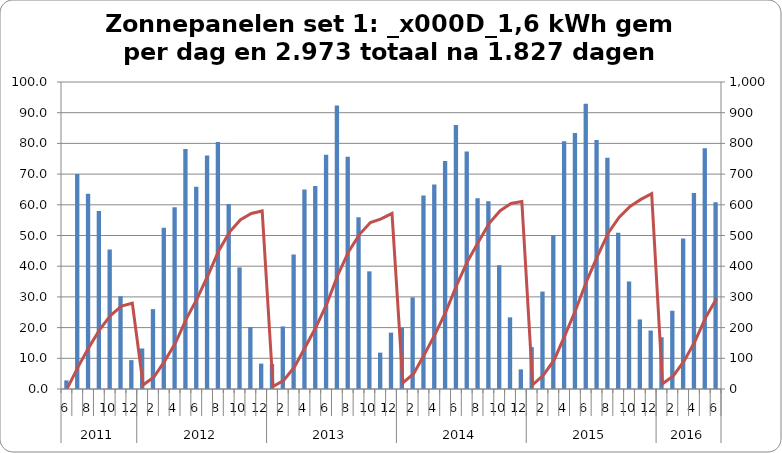
| Category | Som van kWh |
|---|---|
| 0 | 2.81 |
| 1 | 70.026 |
| 2 | 63.564 |
| 3 | 58 |
| 4 | 45.4 |
| 5 | 30.2 |
| 6 | 9.4 |
| 7 | 13.2 |
| 8 | 26 |
| 9 | 52.5 |
| 10 | 59.2 |
| 11 | 78.2 |
| 12 | 65.9 |
| 13 | 76.053 |
| 14 | 80.447 |
| 15 | 60.3 |
| 16 | 39.61 |
| 17 | 20.19 |
| 18 | 8.27 |
| 19 | 8.14 |
| 20 | 20.38 |
| 21 | 43.84 |
| 22 | 65.01 |
| 23 | 66.1 |
| 24 | 76.34 |
| 25 | 92.37 |
| 26 | 75.63 |
| 27 | 55.97 |
| 28 | 38.32 |
| 29 | 11.84 |
| 30 | 18.36 |
| 31 | 20.02 |
| 32 | 29.844 |
| 33 | 63.07 |
| 34 | 66.64 |
| 35 | 74.28 |
| 36 | 85.97 |
| 37 | 77.4 |
| 38 | 62.13 |
| 39 | 61.18 |
| 40 | 40.32 |
| 41 | 23.35 |
| 42 | 6.39 |
| 43 | 13.64 |
| 44 | 31.74 |
| 45 | 50.17 |
| 46 | 80.71 |
| 47 | 83.35 |
| 48 | 92.89 |
| 49 | 81.13 |
| 50 | 75.31 |
| 51 | 50.908 |
| 52 | 35.03 |
| 53 | 22.66 |
| 54 | 19.04 |
| 55 | 16.87 |
| 56 | 25.48 |
| 57 | 49.03 |
| 58 | 63.83 |
| 59 | 78.38 |
| 60 | 60.84 |